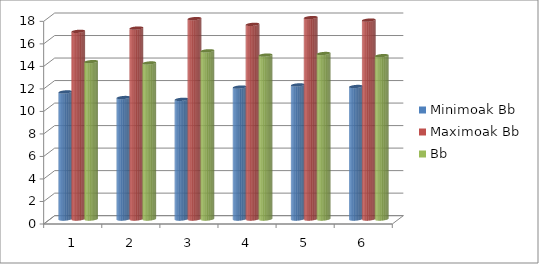
| Category | Minimoak Bb | Maximoak Bb | Bb |
|---|---|---|---|
| 0 | 11.29 | 16.67 | 13.98 |
| 1 | 10.79 | 16.96 | 13.86 |
| 2 | 10.63 | 17.8 | 14.94 |
| 3 | 11.72 | 17.29 | 14.56 |
| 4 | 11.91 | 17.89 | 14.7 |
| 5 | 11.77 | 17.67 | 14.51 |